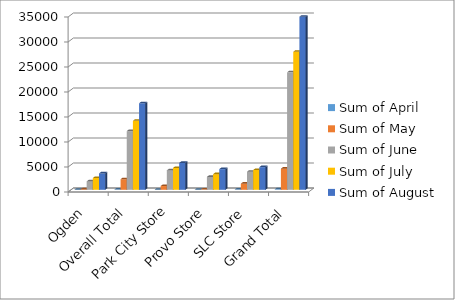
| Category | Sum of April | Sum of May | Sum of June | Sum of July | Sum of August |
|---|---|---|---|---|---|
| Ogden | 0 | 84 | 1677 | 2354 | 3266 |
| Overall Total | 50 | 2113 | 11743 | 13800 | 17306 |
| Park City Store | 0 | 752 | 3876 | 4365 | 5369 |
| Provo Store | 0 | 52 | 2578 | 3126 | 4135 |
| SLC Store | 50 | 1225 | 3612 | 3955 | 4536 |
| Grand Total | 100 | 4226 | 23486 | 27600 | 34612 |